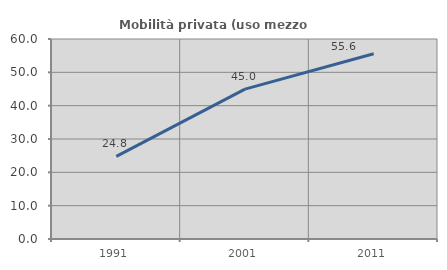
| Category | Mobilità privata (uso mezzo privato) |
|---|---|
| 1991.0 | 24.766 |
| 2001.0 | 44.977 |
| 2011.0 | 55.573 |